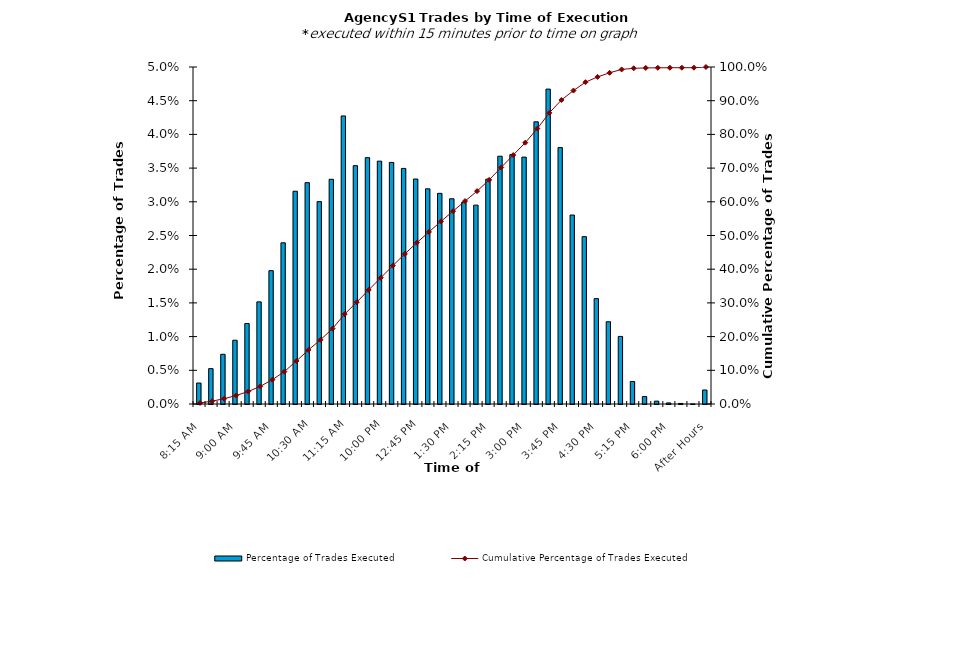
| Category | Percentage of Trades Executed |
|---|---|
| 8:15 AM | 0.003 |
| 8:30 AM | 0.005 |
| 8:45 AM | 0.007 |
| 9:00 AM | 0.009 |
| 9:15 AM | 0.012 |
| 9:30 AM | 0.015 |
| 9:45 AM | 0.02 |
| 10:00 AM | 0.024 |
| 10:15 AM | 0.032 |
| 10:30 AM | 0.033 |
| 10:45 AM | 0.03 |
| 11:00 AM | 0.033 |
| 11:15 AM | 0.043 |
| 11:30 AM | 0.035 |
| 11:45 AM | 0.037 |
| 12:00 PM | 0.036 |
| 12:15 PM | 0.036 |
| 12:30 PM | 0.035 |
| 12:45 PM | 0.033 |
| 1:00 PM | 0.032 |
| 1:15 PM | 0.031 |
| 1:30 PM | 0.03 |
| 1:45 PM | 0.03 |
| 2:00 PM | 0.03 |
| 2:15 PM | 0.033 |
| 2:30 PM | 0.037 |
| 2:45 PM | 0.037 |
| 3:00 PM | 0.037 |
| 3:15 PM | 0.042 |
| 3:30 PM | 0.047 |
| 3:45 PM | 0.038 |
| 4:00 PM | 0.028 |
| 4:15 PM | 0.025 |
| 4:30 PM | 0.016 |
| 4:45 PM | 0.012 |
| 5:00 PM | 0.01 |
| 5:15 PM | 0.003 |
| 5:30 PM | 0.001 |
| 5:45 PM | 0 |
| 6:00 PM | 0 |
| 6:15 PM | 0 |
| 6:30 PM | 0 |
| After Hours | 0.002 |